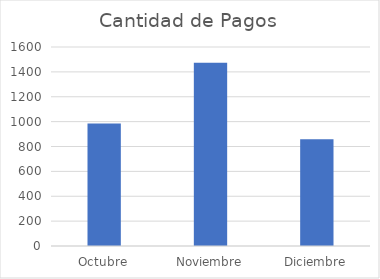
| Category | Cantidad de Pagos |
|---|---|
| Octubre | 984 |
| Noviembre | 1474 |
| Diciembre | 859 |